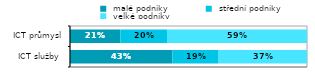
| Category |  malé podniky |  střední podniky |  velké podniky  |
|---|---|---|---|
|   ICT služby  | 0.432 | 0.195 | 0.373 |
|   ICT průmysl | 0.213 | 0.197 | 0.591 |